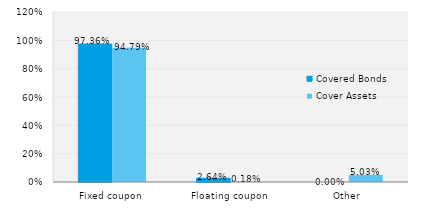
| Category | Covered Bonds | Cover Assets |
|---|---|---|
| Fixed coupon | 0.974 | 0.948 |
| Floating coupon | 0.026 | 0.002 |
| Other | 0 | 0.05 |